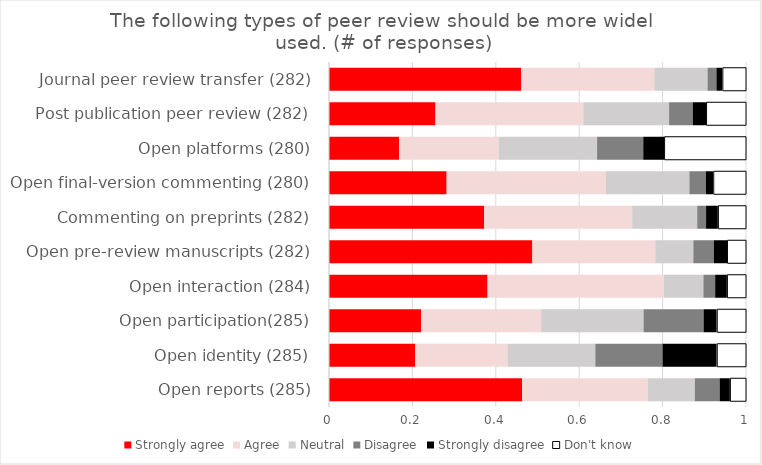
| Category | Strongly agree | Agree | Neutral | Disagree | Strongly disagree | Don't know |
|---|---|---|---|---|---|---|
| Open reports (285) | 0.463 | 0.302 | 0.112 | 0.06 | 0.025 | 0.039 |
| Open identity (285) | 0.207 | 0.221 | 0.211 | 0.161 | 0.13 | 0.07 |
| Open participation(285) | 0.221 | 0.288 | 0.246 | 0.144 | 0.032 | 0.07 |
| Open interaction (284) | 0.38 | 0.423 | 0.095 | 0.028 | 0.028 | 0.046 |
| Open pre-review manuscripts (282) | 0.488 | 0.295 | 0.091 | 0.049 | 0.032 | 0.046 |
| Commenting on preprints (282) | 0.372 | 0.355 | 0.156 | 0.021 | 0.028 | 0.067 |
| Open final-version commenting (280) | 0.282 | 0.382 | 0.2 | 0.039 | 0.018 | 0.079 |
| Open platforms (280) | 0.168 | 0.239 | 0.236 | 0.111 | 0.05 | 0.196 |
| Post publication peer review (282) | 0.255 | 0.355 | 0.206 | 0.057 | 0.032 | 0.096 |
| Journal peer review transfer (282) | 0.461 | 0.319 | 0.128 | 0.021 | 0.014 | 0.057 |